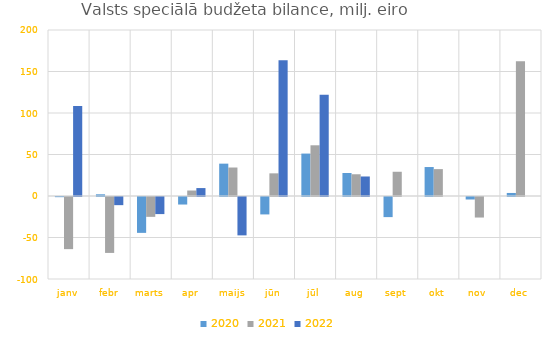
| Category | 2020 | 2021 | 2022 |
|---|---|---|---|
| janv | -199.839 | -62808.075 | 108554.179 |
| febr | 2049.427 | -67375.438 | -9818.538 |
| marts | -43219.176 | -23930.666 | -20590.078 |
| apr | -9074.401 | 6610.878 | 9551.101 |
| maijs | 38978.317 | 34323.187 | -46228.723 |
| jūn | -20988.328 | 27288.039 | 163534.283 |
| jūl | 51118.587 | 61101.998 | 121861.127 |
| aug | 27698.363 | 26197.43 | 23515.069 |
| sept | -24231.793 | 29202.435 | 0 |
| okt | 34894.946 | 32397.037 | 0 |
| nov | -3008.189 | -24738.863 | 0 |
| dec | 3652.649 | 162256.524 | 0 |